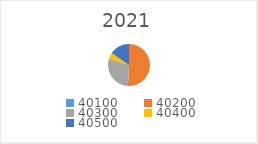
| Category | Series 0 |
|---|---|
| 40100.0 | 0 |
| 40200.0 | 721223.69 |
| 40300.0 | 411000 |
| 40400.0 | 68253.88 |
| 40500.0 | 218382.55 |